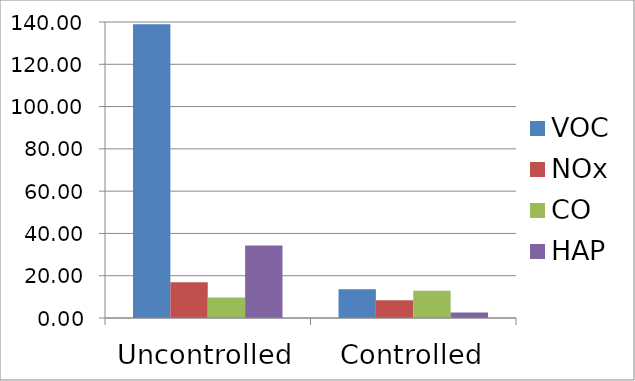
| Category | VOC | NOx | CO | HAP |
|---|---|---|---|---|
| Uncontrolled | 138.982 | 16.929 | 9.696 | 34.303 |
| Controlled | 13.547 | 8.45 | 12.937 | 2.549 |